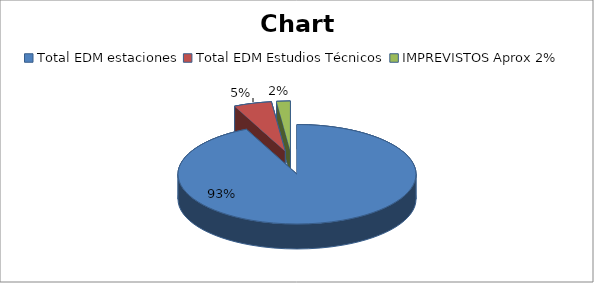
| Category | Series 0 | Series 1 |
|---|---|---|
| Total EDM estaciones | 3643902548 |  |
| Total EDM Estudios Técnicos | 201376000 |  |
| IMPREVISTOS Aprox 2% | 72848942.02 |  |